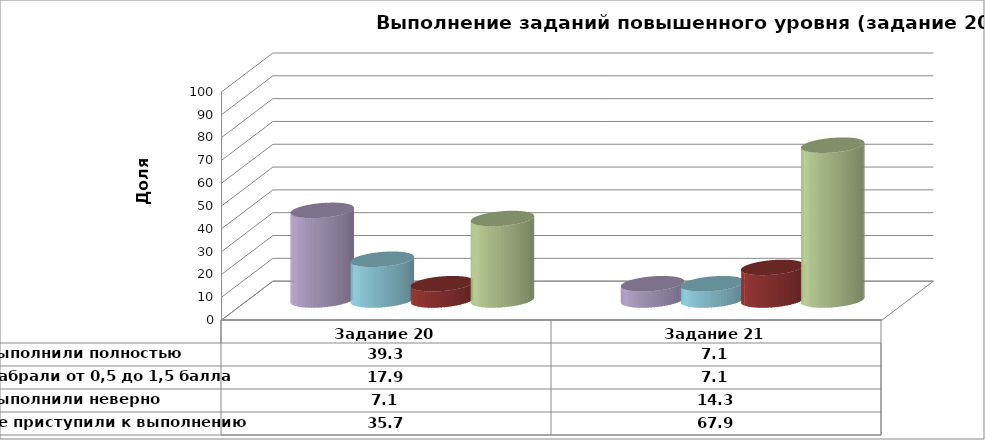
| Category | Series 1 | Выполнили полностью | Series 3 | Набрали от 0,5 до 1,5 балла | Series 5 | Выполнили неверно | Series 7 | Не приступили к выполнению |
|---|---|---|---|---|---|---|---|---|
| Задание 20 |  | 39.286 |  | 17.857 |  | 7.143 |  | 35.714 |
| Задание 21 |  | 7.143 |  | 7.143 |  | 14.286 |  | 67.857 |